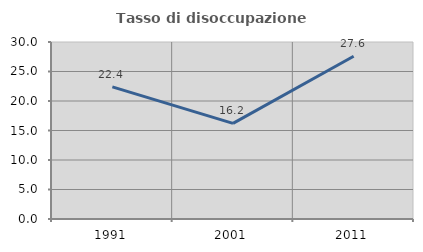
| Category | Tasso di disoccupazione giovanile  |
|---|---|
| 1991.0 | 22.387 |
| 2001.0 | 16.205 |
| 2011.0 | 27.578 |